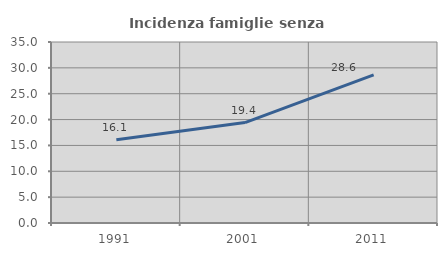
| Category | Incidenza famiglie senza nuclei |
|---|---|
| 1991.0 | 16.097 |
| 2001.0 | 19.427 |
| 2011.0 | 28.634 |